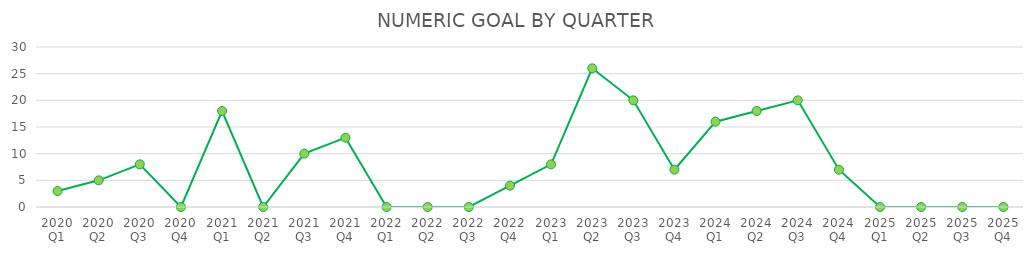
| Category | NUMERIC GOAL |
|---|---|
| 2020 Q1 | 3 |
| 2020 Q2 | 5 |
| 2020 Q3 | 8 |
| 2020 Q4 | 0 |
| 2021 Q1 | 18 |
| 2021 Q2 | 0 |
| 2021 Q3 | 10 |
| 2021 Q4 | 13 |
| 2022 Q1 | 0 |
| 2022 Q2 | 0 |
| 2022 Q3 | 0 |
| 2022 Q4 | 4 |
| 2023 Q1 | 8 |
| 2023 Q2 | 26 |
| 2023 Q3 | 20 |
| 2023 Q4 | 7 |
| 2024 Q1 | 16 |
| 2024 Q2 | 18 |
| 2024 Q3 | 20 |
| 2024 Q4 | 7 |
| 2025 Q1 | 0 |
| 2025 Q2 | 0 |
| 2025 Q3 | 0 |
| 2025 Q4 | 0 |